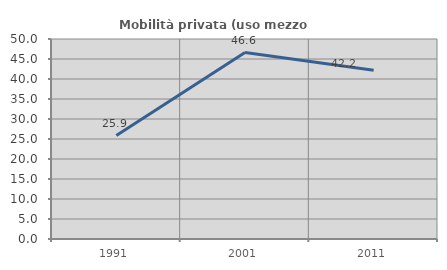
| Category | Mobilità privata (uso mezzo privato) |
|---|---|
| 1991.0 | 25.874 |
| 2001.0 | 46.606 |
| 2011.0 | 42.169 |